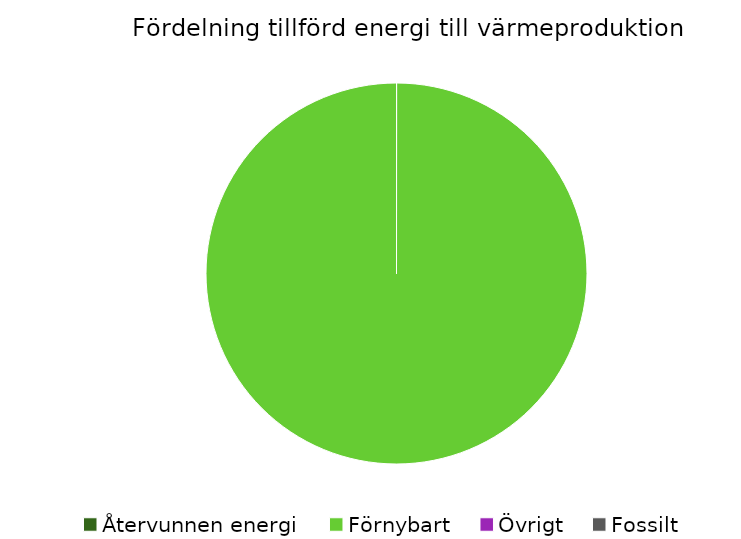
| Category | Fördelning värmeproduktion |
|---|---|
| Återvunnen energi | 0 |
| Förnybart | 1 |
| Övrigt | 0 |
| Fossilt | 0 |